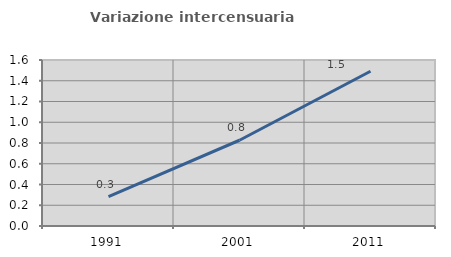
| Category | Variazione intercensuaria annua |
|---|---|
| 1991.0 | 0.283 |
| 2001.0 | 0.827 |
| 2011.0 | 1.492 |